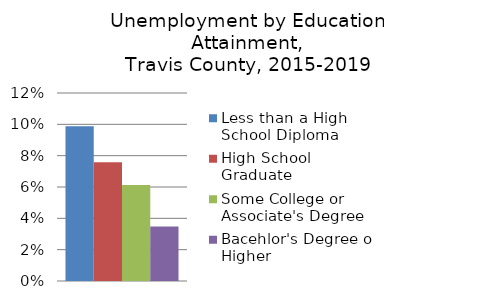
| Category | Less than a High School Diploma | High School Graduate | Some College or Associate's Degree | Bacehlor's Degree or Higher |
|---|---|---|---|---|
| 0 | 0.099 | 0.076 | 0.061 | 0.035 |